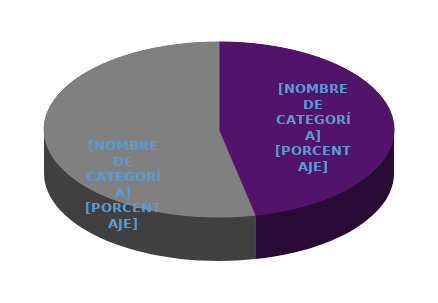
| Category | Series 0 |
|---|---|
| FEMENINO | 7 |
| MASCULINO | 8 |